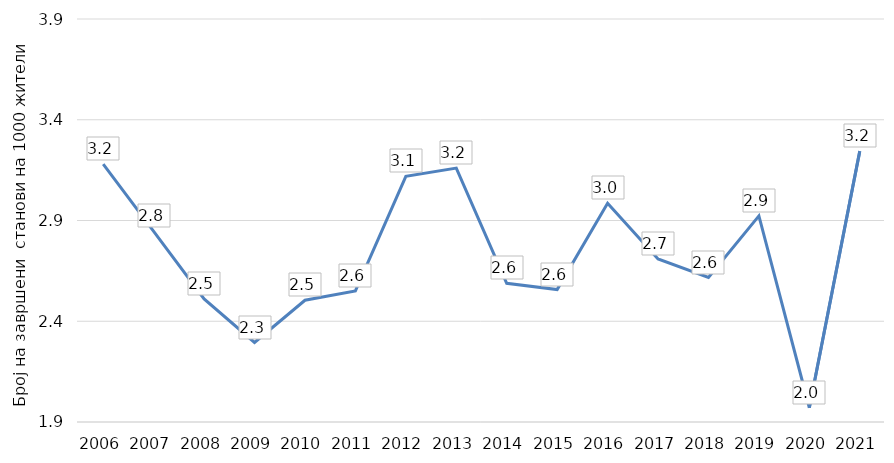
| Category | Република Македонија |
|---|---|
| 2006 | 3.18 |
| 2007 | 2.846 |
| 2008 | 2.511 |
| 2009 | 2.295 |
| 2010 | 2.504 |
| 2011 | 2.551 |
| 2012 | 3.119 |
| 2013 | 3.16 |
| 2014 | 2.588 |
| 2015 | 2.557 |
| 2016 | 2.986 |
| 2017 | 2.709 |
| 2018 | 2.617 |
| 2019 | 2.923 |
| 2020 | 1.971 |
| 2021 | 3.244 |